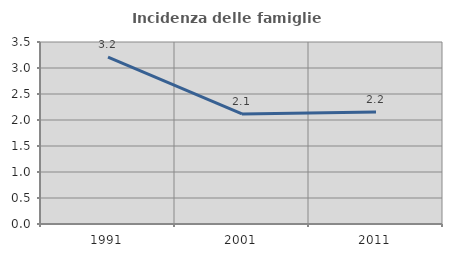
| Category | Incidenza delle famiglie numerose |
|---|---|
| 1991.0 | 3.209 |
| 2001.0 | 2.118 |
| 2011.0 | 2.155 |